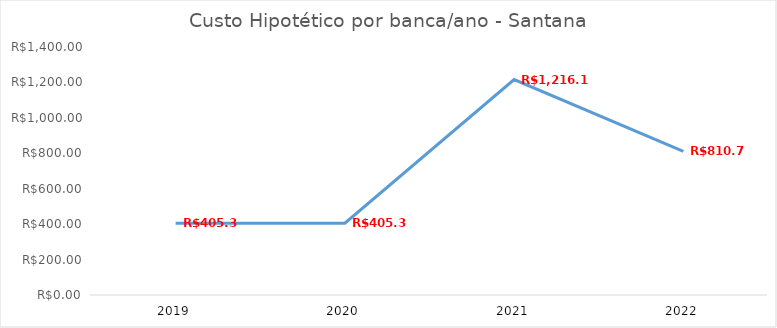
| Category | Series 0 |
|---|---|
| 2019.0 | 405.39 |
| 2020.0 | 405.39 |
| 2021.0 | 1216.17 |
| 2022.0 | 810.78 |